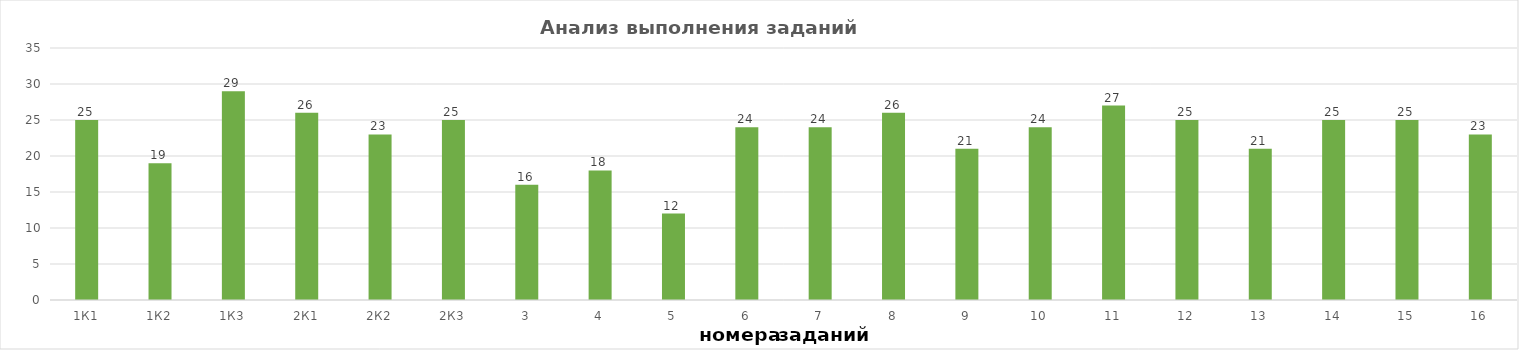
| Category | задания |
|---|---|
| 1К1 | 25 |
| 1К2 | 19 |
| 1К3 | 29 |
| 2К1 | 26 |
| 2К2 | 23 |
| 2К3 | 25 |
| 3 | 16 |
| 4 | 18 |
| 5 | 12 |
| 6 | 24 |
| 7 | 24 |
| 8 | 26 |
| 9 | 21 |
| 10 | 24 |
| 11 | 27 |
| 12 | 25 |
| 13 | 21 |
| 14 | 25 |
| 15 | 25 |
| 16 | 23 |